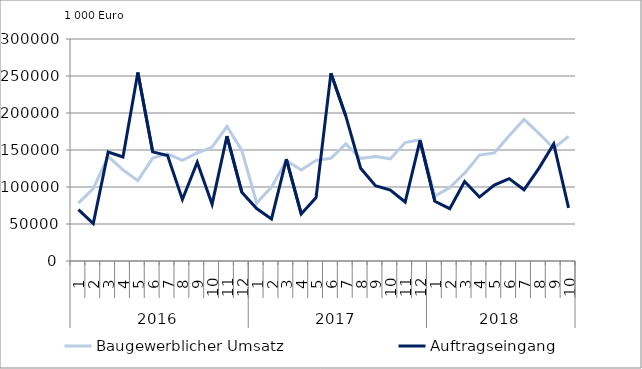
| Category | Baugewerblicher Umsatz | Auftragseingang |
|---|---|---|
| 0 | 78291.738 | 69470.357 |
| 1 | 97863.379 | 50640.033 |
| 2 | 141176.119 | 147206.65 |
| 3 | 123121.297 | 140579.009 |
| 4 | 108561.124 | 254739.334 |
| 5 | 139030.209 | 147481.644 |
| 6 | 144784.416 | 142609.658 |
| 7 | 135870.195 | 83192.156 |
| 8 | 145961.738 | 133594.351 |
| 9 | 153886.826 | 76793.838 |
| 10 | 181740.037 | 168867.568 |
| 11 | 149348.138 | 93011.853 |
| 12 | 78446.78 | 70908.903 |
| 13 | 99841.908 | 56868.408 |
| 14 | 135679.867 | 137790.423 |
| 15 | 123004.403 | 63637.761 |
| 16 | 136010.071 | 85644.63 |
| 17 | 138859.308 | 253791.552 |
| 18 | 158353.879 | 196034.198 |
| 19 | 138510.315 | 125319.873 |
| 20 | 141109.925 | 101690.626 |
| 21 | 138067.098 | 95966.626 |
| 22 | 160064.454 | 79701.993 |
| 23 | 163969.017 | 162878.607 |
| 24 | 87640.529 | 80684.627 |
| 25 | 99259.455 | 70746.763 |
| 26 | 118764.324 | 107538.747 |
| 27 | 143144.178 | 86374.619 |
| 28 | 146070.782 | 102661.329 |
| 29 | 169150.753 | 111287.709 |
| 30 | 191277.885 | 96286.662 |
| 31 | 172425.535 | 125142.495 |
| 32 | 152354.98 | 158112.302 |
| 33 | 168372.756 | 71808.619 |